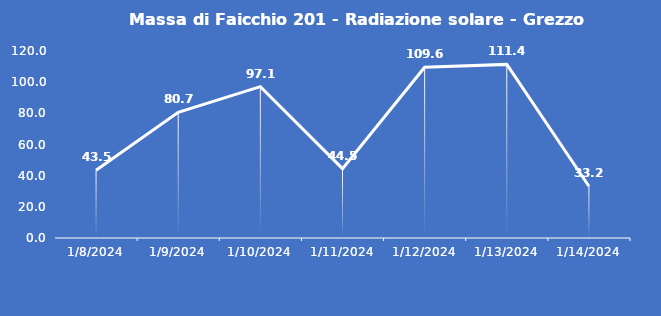
| Category | Massa di Faicchio 201 - Radiazione solare - Grezzo (W/m2) |
|---|---|
| 1/8/24 | 43.5 |
| 1/9/24 | 80.7 |
| 1/10/24 | 97.1 |
| 1/11/24 | 44.5 |
| 1/12/24 | 109.6 |
| 1/13/24 | 111.4 |
| 1/14/24 | 33.2 |